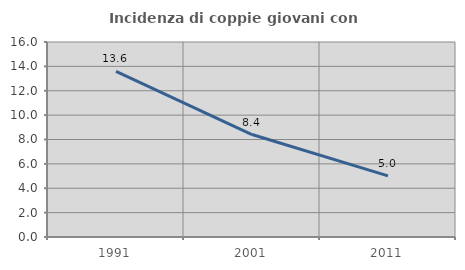
| Category | Incidenza di coppie giovani con figli |
|---|---|
| 1991.0 | 13.592 |
| 2001.0 | 8.408 |
| 2011.0 | 5.018 |